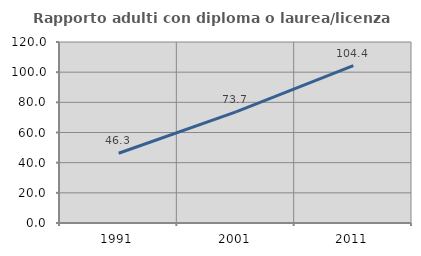
| Category | Rapporto adulti con diploma o laurea/licenza media  |
|---|---|
| 1991.0 | 46.269 |
| 2001.0 | 73.677 |
| 2011.0 | 104.37 |